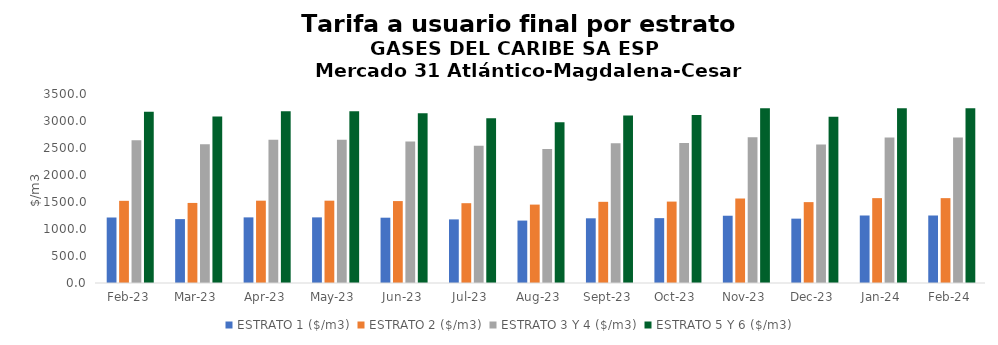
| Category | ESTRATO 1 ($/m3) | ESTRATO 2 ($/m3) | ESTRATO 3 Y 4 ($/m3) | ESTRATO 5 Y 6 ($/m3) |
|---|---|---|---|---|
| 2023-02-01 | 1212.89 | 1521.57 | 2641.83 | 3170.196 |
| 2023-03-01 | 1183.19 | 1482.78 | 2568.94 | 3082.728 |
| 2023-04-01 | 1215.25 | 1524.46 | 2651.33 | 3181.596 |
| 2023-05-01 | 1215.25 | 1524.46 | 2651.33 | 3181.596 |
| 2023-06-01 | 1209.41 | 1517.12 | 2619.03 | 3142.836 |
| 2023-07-01 | 1178 | 1477.97 | 2542.18 | 3050.616 |
| 2023-08-01 | 1155.93 | 1451.92 | 2479.28 | 2975.136 |
| 2023-09-01 | 1198 | 1503.27 | 2586.8 | 3104.16 |
| 2023-10-01 | 1201.13 | 1507.69 | 2594.42 | 3113.304 |
| 2023-11-01 | 1245.69 | 1564.66 | 2697.24 | 3236.688 |
| 2023-12-01 | 1191.7 | 1497.74 | 2567.03 | 3080.436 |
| 2024-01-01 | 1250.09 | 1571.48 | 2695.95 | 3235.14 |
| 2024-02-01 | 1250.09 | 1571.48 | 2695.95 | 3235.14 |